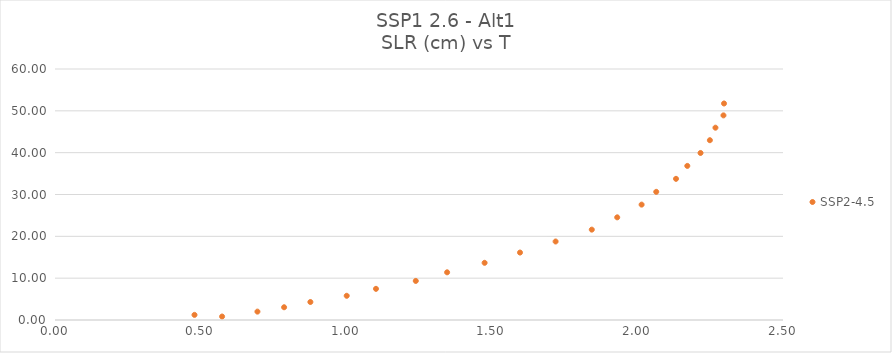
| Category | SSP2-4.5 |
|---|---|
| 0.573801925 | 0.83 |
| 0.479031654 | 1.225 |
| 0.695197934 | 2.004 |
| 0.786748548 | 3.047 |
| 0.877021499 | 4.302 |
| 1.001775485 | 5.786 |
| 1.102283052 | 7.449 |
| 1.238965881 | 9.339 |
| 1.346534915 | 11.401 |
| 1.475335407 | 13.668 |
| 1.59687626 | 16.123 |
| 1.719141477 | 18.766 |
| 1.843360468 | 21.599 |
| 1.930688807 | 24.541 |
| 2.014491607 | 27.58 |
| 2.064698628 | 30.636 |
| 2.132598574 | 33.744 |
| 2.171386719 | 36.837 |
| 2.216804289 | 39.926 |
| 2.248885066 | 42.98 |
| 2.268046215 | 45.97 |
| 2.295557548 | 48.914 |
| 2.297490907 | 51.756 |